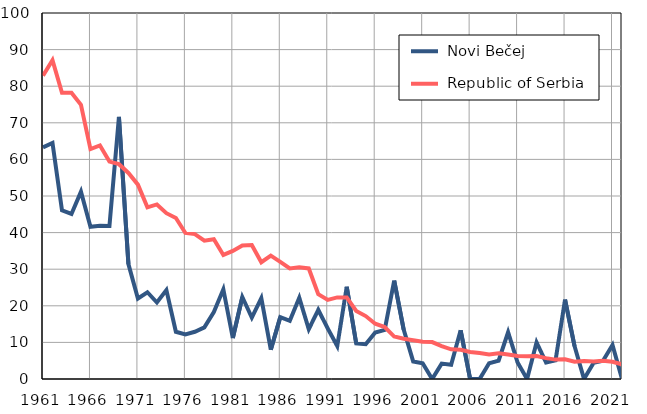
| Category |  Novi Bečej |  Republic of Serbia |
|---|---|---|
| 1961.0 | 63.3 | 82.9 |
| 1962.0 | 64.5 | 87.1 |
| 1963.0 | 46.1 | 78.2 |
| 1964.0 | 45.1 | 78.2 |
| 1965.0 | 51.2 | 74.9 |
| 1966.0 | 41.6 | 62.8 |
| 1967.0 | 41.9 | 63.8 |
| 1968.0 | 41.8 | 59.4 |
| 1969.0 | 71.6 | 58.7 |
| 1970.0 | 31.4 | 56.3 |
| 1971.0 | 22 | 53.1 |
| 1972.0 | 23.7 | 46.9 |
| 1973.0 | 20.9 | 47.7 |
| 1974.0 | 24.3 | 45.3 |
| 1975.0 | 12.9 | 44 |
| 1976.0 | 12.2 | 39.9 |
| 1977.0 | 12.9 | 39.6 |
| 1978.0 | 14.1 | 37.8 |
| 1979.0 | 18.3 | 38.2 |
| 1980.0 | 24.5 | 33.9 |
| 1981.0 | 11.2 | 35 |
| 1982.0 | 22.4 | 36.5 |
| 1983.0 | 16.8 | 36.6 |
| 1984.0 | 22.1 | 31.9 |
| 1985.0 | 8 | 33.7 |
| 1986.0 | 16.9 | 32 |
| 1987.0 | 15.9 | 30.2 |
| 1988.0 | 22.2 | 30.5 |
| 1989.0 | 13.6 | 30.2 |
| 1990.0 | 18.9 | 23.2 |
| 1991.0 | 13.8 | 21.6 |
| 1992.0 | 9 | 22.3 |
| 1993.0 | 25.2 | 22.3 |
| 1994.0 | 9.7 | 18.6 |
| 1995.0 | 9.5 | 17.2 |
| 1996.0 | 12.7 | 15.1 |
| 1997.0 | 13.4 | 14.2 |
| 1998.0 | 26.9 | 11.6 |
| 1999.0 | 13.5 | 11 |
| 2000.0 | 4.8 | 10.6 |
| 2001.0 | 4.3 | 10.2 |
| 2002.0 | 0 | 10.1 |
| 2003.0 | 4.2 | 9 |
| 2004.0 | 3.9 | 8.1 |
| 2005.0 | 13.3 | 8 |
| 2006.0 | 0 | 7.4 |
| 2007.0 | 0 | 7.1 |
| 2008.0 | 4.3 | 6.7 |
| 2009.0 | 5 | 7 |
| 2010.0 | 12.8 | 6.7 |
| 2011.0 | 4.5 | 6.3 |
| 2012.0 | 0 | 6.2 |
| 2013.0 | 10 | 6.3 |
| 2014.0 | 4.5 | 5.7 |
| 2015.0 | 5.1 | 5.3 |
| 2016.0 | 21.7 | 5.4 |
| 2017.0 | 9 | 4.7 |
| 2018.0 | 0 | 4.9 |
| 2019.0 | 4.4 | 4.8 |
| 2020.0 | 5 | 5 |
| 2021.0 | 9.3 | 4.7 |
| 2022.0 | 0 | 4 |